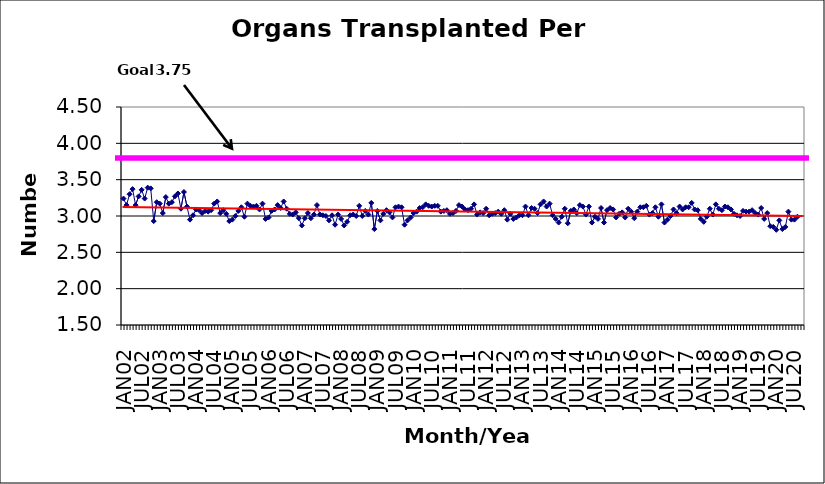
| Category | Series 0 |
|---|---|
| JAN02 | 3.24 |
| FEB02 | 3.15 |
| MAR02 | 3.3 |
| APR02 | 3.37 |
| MAY02 | 3.15 |
| JUN02 | 3.27 |
| JUL02 | 3.36 |
| AUG02 | 3.24 |
| SEP02 | 3.39 |
| OCT02 | 3.38 |
| NOV02 | 2.93 |
| DEC02 | 3.19 |
| JAN03 | 3.17 |
| FEB03 | 3.04 |
| MAR03 | 3.26 |
| APR03 | 3.17 |
| MAY03 | 3.19 |
| JUN03 | 3.27 |
| JUL03 | 3.31 |
| AUG03 | 3.1 |
| SEP03 | 3.33 |
| OCT03 | 3.13 |
| NOV03 | 2.95 |
| DEC03 | 3.01 |
| JAN04 | 3.09 |
| FEB04 | 3.08 |
| MAR04 | 3.04 |
| APR04 | 3.07 |
| MAY04 | 3.06 |
| JUN04 | 3.08 |
| JUL04 | 3.17 |
| AUG04 | 3.2 |
| SEP04 | 3.04 |
| OCT04 | 3.08 |
| NOV04 | 3.03 |
| DEC04 | 2.93 |
| JAN05 | 2.95 |
| FEB05 | 3 |
| MAR05 | 3.07 |
| APR05 | 3.12 |
| MAY05 | 2.99 |
| JUN05 | 3.17 |
| JUL05 | 3.14 |
| AUG05 | 3.13 |
| SEP05 | 3.14 |
| OCT05 | 3.09 |
| NOV05 | 3.17 |
| DEC05 | 2.96 |
| JAN06 | 2.98 |
| FEB06 | 3.07 |
| MAR06 | 3.09 |
| APR06 | 3.15 |
| MAY06 | 3.11 |
| JUN06 | 3.2 |
| JUL06 | 3.1 |
| AUG06 | 3.03 |
| SEP06 | 3.02 |
| OCT06 | 3.05 |
| NOV06 | 2.97 |
| DEC06 | 2.87 |
| JAN07 | 2.97 |
| FEB07 | 3.04 |
| MAR07 | 2.97 |
| APR07 | 3.02 |
| MAY07 | 3.15 |
| JUN07 | 3.02 |
| JUL07 | 3.01 |
| AUG07 | 3 |
| SEP07 | 2.94 |
| OCT07 | 3.01 |
| NOV07 | 2.88 |
| DEC07 | 3.02 |
| JAN08 | 2.96 |
| FEB08 | 2.87 |
| MAR08 | 2.92 |
| APR08 | 3.01 |
| MAY08 | 3.02 |
| JUN08 | 3 |
| JUL08 | 3.14 |
| AUG08 | 3 |
| SEP08 | 3.07 |
| OCT08 | 3.02 |
| NOV08 | 3.18 |
| DEC08 | 2.82 |
| JAN09 | 3.07 |
| FEB09 | 2.94 |
| MAR09 | 3.03 |
| APR09 | 3.08 |
| MAY09 | 3.05 |
| JUN09 | 2.98 |
| JUL09 | 3.12 |
| AUG09 | 3.13 |
| SEP09 | 3.12 |
| OCT09 | 2.88 |
| NOV09 | 2.94 |
| DEC09 | 2.98 |
| JAN10 | 3.04 |
| FEB10 | 3.06 |
| MAR10 | 3.11 |
| APR10 | 3.12 |
| MAY10 | 3.16 |
| JUN10 | 3.14 |
| JUL10 | 3.13 |
| AUG10 | 3.14 |
| SEP10 | 3.14 |
| OCT10 | 3.06 |
| NOV10 | 3.07 |
| DEC10 | 3.08 |
| JAN11 | 3.03 |
| FEB11 | 3.04 |
| MAR11 | 3.07 |
| APR11 | 3.15 |
| MAY11 | 3.13 |
| JUN11 | 3.09 |
| JUL11 | 3.08 |
| AUG11 | 3.1 |
| SEP11 | 3.16 |
| OCT11 | 3.02 |
| NOV11 | 3.05 |
| DEC11 | 3.04 |
| JAN12 | 3.1 |
| FEB12 | 3.01 |
| MAR12 | 3.03 |
| APR12 | 3.04 |
| MAY12 | 3.06 |
| JUN12 | 3.03 |
| JUL12 | 3.08 |
| AUG12 | 2.95 |
| SEP12 | 3.03 |
| OCT12 | 2.96 |
| NOV12 | 2.98 |
| DEC12 | 3.01 |
| JAN13 | 3.01 |
| FEB13 | 3.13 |
| MAR13 | 3.01 |
| APR13 | 3.11 |
| MAY13 | 3.1 |
| JUN13 | 3.04 |
| JUL13 | 3.16 |
| AUG13 | 3.2 |
| SEP13 | 3.13 |
| OCT13 | 3.17 |
| NOV13 | 3.01 |
| DEC13 | 2.96 |
| JAN14 | 2.91 |
| FEB14 | 2.99 |
| MAR14 | 3.1 |
| APR14 | 2.9 |
| MAY14 | 3.07 |
| JUN14 | 3.09 |
| JUL14 | 3.04 |
| AUG14 | 3.15 |
| SEP14 | 3.13 |
| OCT14 | 3.02 |
| NOV14 | 3.13 |
| DEC14 | 2.91 |
| JAN15 | 2.99 |
| FEB15 | 2.96 |
| MAR15 | 3.11 |
| APR15 | 2.91 |
| MAY15 | 3.08 |
| JUN15 | 3.11 |
| JUL15 | 3.09 |
| AUG15 | 2.98 |
| SEP15 | 3.03 |
| OCT15 | 3.05 |
| NOV15 | 2.98 |
| DEC15 | 3.1 |
| JAN16 | 3.06 |
| FEB16 | 2.97 |
| MAR16 | 3.06 |
| APR16 | 3.12 |
| MAY16 | 3.12 |
| JUN16 | 3.14 |
| JUL16 | 3.02 |
| AUG16 | 3.04 |
| SEP16 | 3.12 |
| OCT16 | 2.99 |
| NOV16 | 3.16 |
| DEC16 | 2.91 |
| JAN17 | 2.95 |
| FEB17 | 3 |
| MAR17 | 3.09 |
| APR17 | 3.04 |
| MAY17 | 3.13 |
| JUN17 | 3.09 |
| JUL17 | 3.12 |
| AUG17 | 3.12 |
| SEP17 | 3.18 |
| OCT17 | 3.09 |
| NOV17 | 3.08 |
| DEC17 | 2.96 |
| JAN18 | 2.92 |
| FEB18 | 2.99 |
| MAR18 | 3.1 |
| APR18 | 3.02 |
| MAY18 | 3.16 |
| JUN18 | 3.1 |
| JUL18 | 3.08 |
| AUG18 | 3.13 |
| SEP18 | 3.12 |
| OCT18 | 3.09 |
| NOV18 | 3.03 |
| DEC18 | 3.01 |
| JAN19 | 3 |
| FEB19 | 3.07 |
| MAR19 | 3.06 |
| APR19 | 3.06 |
| MAY19 | 3.08 |
| JUN19 | 3.04 |
| JUL19 | 3.02 |
| AUG19 | 3.11 |
| SEP19 | 2.96 |
| OCT19 | 3.04 |
| NOV19 | 2.86 |
| DEC19 | 2.85 |
| JAN20 | 2.81 |
| FEB20 | 2.94 |
| MAR20 | 2.82 |
| APR20 | 2.85 |
| MAY20 | 3.06 |
| JUN20 | 2.95 |
| JUL20 | 2.95 |
| AUG20 | 2.99 |